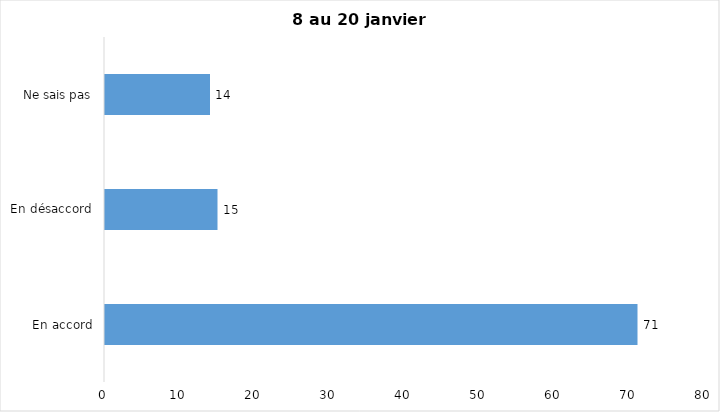
| Category | J’ai l’intention de recevoir le vaccin contre la COVID-19 lorsqu’il
sera disponible |
|---|---|
| En accord | 71 |
| En désaccord | 15 |
| Ne sais pas | 14 |